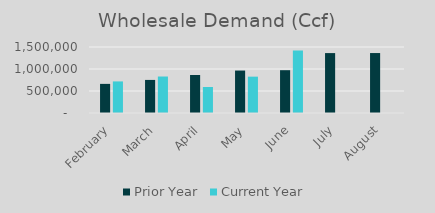
| Category | Prior Year | Current Year |
|---|---|---|
| February | 661790 | 717715 |
| March | 751769 | 829129 |
| April | 864122 | 591056.98 |
| May | 964707 | 825870 |
| June | 973004 | 1420311.82 |
| July | 1361707 | 0 |
| August | 1362622 | 0 |